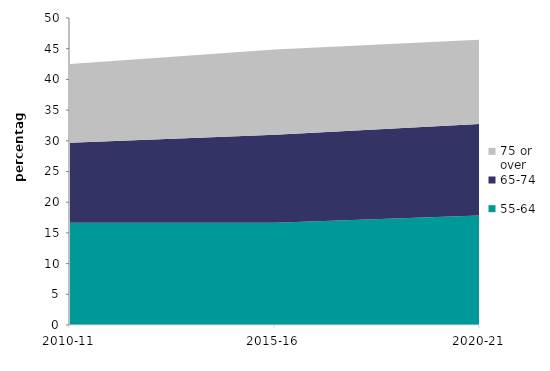
| Category | 55-64 | 65-74 | 75 or over |
|---|---|---|---|
| 2010-11 | 16.67 | 13.001 | 12.847 |
| 2015-16 | 16.661 | 14.327 | 13.881 |
| 2020-21 | 17.856 | 14.868 | 13.739 |